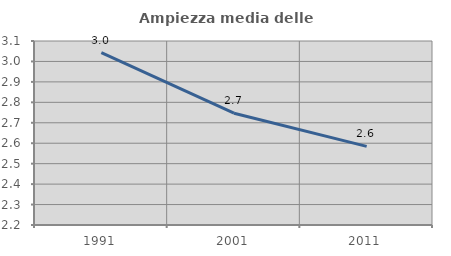
| Category | Ampiezza media delle famiglie |
|---|---|
| 1991.0 | 3.044 |
| 2001.0 | 2.747 |
| 2011.0 | 2.584 |